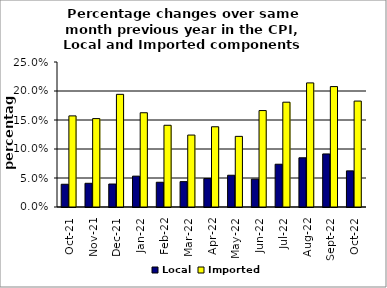
| Category | Local | Imported |
|---|---|---|
| 2021-10-01 | 0.039 | 0.157 |
| 2021-11-01 | 0.041 | 0.152 |
| 2021-12-01 | 0.04 | 0.194 |
| 2022-01-01 | 0.053 | 0.163 |
| 2022-02-01 | 0.043 | 0.141 |
| 2022-03-01 | 0.044 | 0.124 |
| 2022-04-01 | 0.049 | 0.138 |
| 2022-05-01 | 0.055 | 0.122 |
| 2022-06-01 | 0.048 | 0.166 |
| 2022-07-01 | 0.074 | 0.181 |
| 2022-08-01 | 0.085 | 0.214 |
| 2022-09-01 | 0.091 | 0.208 |
| 2022-10-01 | 0.062 | 0.183 |